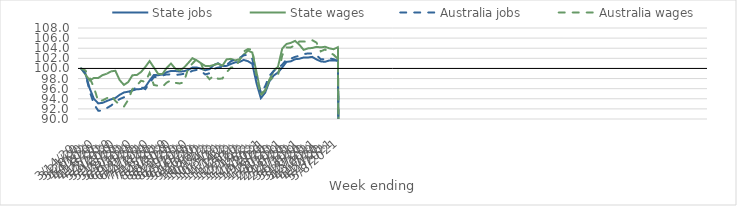
| Category | State jobs | State wages | Australia jobs | Australia wages |
|---|---|---|---|---|
| 14/03/2020 | 100 | 100 | 100 | 100 |
| 21/03/2020 | 99.011 | 98.802 | 98.971 | 99.603 |
| 28/03/2020 | 96.049 | 97.639 | 95.467 | 98.105 |
| 04/04/2020 | 93.972 | 98.129 | 92.92 | 96.234 |
| 11/04/2020 | 93.088 | 98.11 | 91.647 | 93.487 |
| 18/04/2020 | 93.191 | 98.679 | 91.63 | 93.692 |
| 25/04/2020 | 93.558 | 98.958 | 92.16 | 94.108 |
| 02/05/2020 | 93.89 | 99.422 | 92.657 | 94.655 |
| 09/05/2020 | 94.156 | 99.541 | 93.343 | 93.578 |
| 16/05/2020 | 94.775 | 97.695 | 93.935 | 92.812 |
| 23/05/2020 | 95.25 | 96.743 | 94.291 | 92.462 |
| 30/05/2020 | 95.406 | 97.299 | 94.798 | 93.79 |
| 06/06/2020 | 95.642 | 98.671 | 95.781 | 95.926 |
| 13/06/2020 | 95.893 | 98.692 | 96.28 | 96.602 |
| 20/06/2020 | 95.918 | 99.295 | 96.296 | 97.58 |
| 27/06/2020 | 96.343 | 100.298 | 95.902 | 97.326 |
| 04/07/2020 | 97.608 | 101.458 | 97.157 | 99.113 |
| 11/07/2020 | 98.712 | 100.19 | 98.279 | 96.733 |
| 18/07/2020 | 98.663 | 98.928 | 98.382 | 96.561 |
| 25/07/2020 | 98.799 | 98.89 | 98.604 | 96.362 |
| 01/08/2020 | 99.264 | 100.105 | 98.826 | 97.197 |
| 08/08/2020 | 99.508 | 100.965 | 98.822 | 97.652 |
| 15/08/2020 | 99.493 | 99.963 | 98.73 | 97.16 |
| 22/08/2020 | 99.395 | 99.609 | 98.792 | 97.027 |
| 29/08/2020 | 99.439 | 100.137 | 98.928 | 97.246 |
| 05/09/2020 | 99.703 | 101.042 | 99.113 | 99.964 |
| 12/09/2020 | 100.17 | 102.027 | 99.531 | 100.967 |
| 19/09/2020 | 100.191 | 101.601 | 99.714 | 101.852 |
| 26/09/2020 | 99.97 | 101.036 | 99.52 | 101.02 |
| 03/10/2020 | 99.64 | 100.501 | 98.806 | 98.883 |
| 10/10/2020 | 99.864 | 100.454 | 99.055 | 97.873 |
| 17/10/2020 | 100.672 | 100.686 | 99.899 | 98.568 |
| 24/10/2020 | 101.029 | 100.953 | 100.18 | 97.964 |
| 31/10/2020 | 100.474 | 100.52 | 100.306 | 97.998 |
| 07/11/2020 | 100.509 | 101.793 | 100.68 | 99.252 |
| 14/11/2020 | 100.893 | 101.894 | 101.424 | 100.173 |
| 21/11/2020 | 101.204 | 101.587 | 101.745 | 100.229 |
| 28/11/2020 | 101.262 | 101.828 | 102.059 | 101.576 |
| 05/12/2020 | 101.683 | 102.736 | 102.608 | 103.362 |
| 12/12/2020 | 101.425 | 103.534 | 102.679 | 103.837 |
| 19/12/2020 | 100.909 | 103.151 | 101.871 | 103.708 |
| 26/12/2020 | 97.026 | 99.202 | 98.073 | 98.239 |
| 02/01/2021 | 94.125 | 95.026 | 95.142 | 94.651 |
| 09/01/2021 | 95.199 | 95.639 | 96.464 | 95.644 |
| 16/01/2021 | 97.43 | 97.76 | 98.546 | 97.678 |
| 23/01/2021 | 98.598 | 99.525 | 99.493 | 98.293 |
| 30/01/2021 | 99.196 | 100.336 | 99.995 | 98.662 |
| 06/02/2021 | 100.196 | 103.941 | 100.749 | 102.61 |
| 13/02/2021 | 101.296 | 104.841 | 101.78 | 104.166 |
| 20/02/2021 | 101.41 | 105.06 | 101.937 | 104.163 |
| 27/02/2021 | 101.827 | 105.449 | 102.282 | 104.593 |
| 06/03/2021 | 101.913 | 104.691 | 102.496 | 105.335 |
| 13/03/2021 | 102.171 | 103.672 | 102.825 | 105.317 |
| 20/03/2021 | 102.163 | 103.965 | 102.964 | 105.281 |
| 27/03/2021 | 102.291 | 104.048 | 102.951 | 105.588 |
| 03/04/2021 | 101.778 | 104.271 | 102.614 | 105.117 |
| 10/04/2021 | 101.4 | 104.167 | 101.84 | 103.377 |
| 17/04/2021 | 101.308 | 104.289 | 101.797 | 103.762 |
| 24/04/2021 | 101.582 | 103.977 | 102 | 103.175 |
| 01/05/2021 | 101.55 | 103.798 | 101.825 | 102.713 |
| 08/05/2021 | 101.575 | 104.21 | 101.453 | 101.885 |